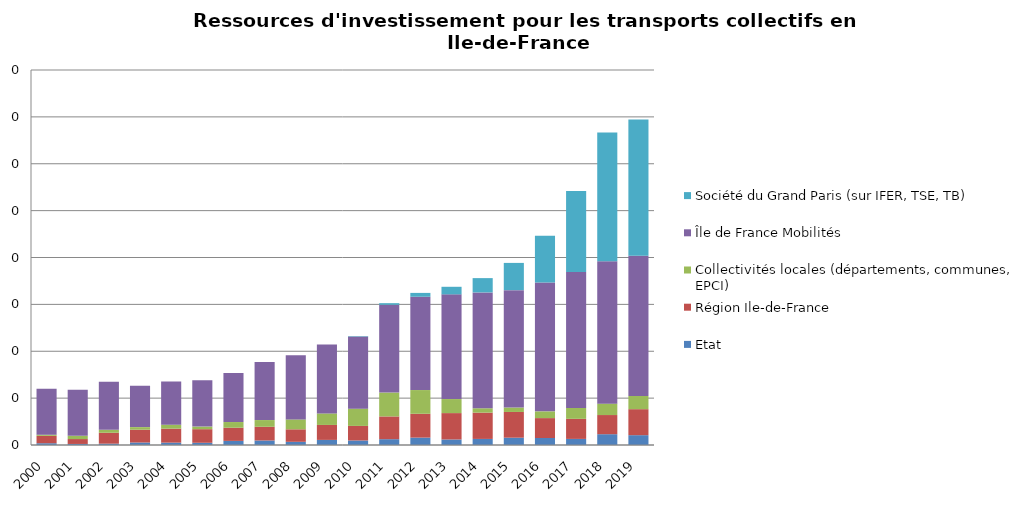
| Category | Etat | Région Ile-de-France | Collectivités locales (départements, communes, EPCI) | Île de France Mobilités | Société du Grand Paris (sur IFER, TSE, TB) |
|---|---|---|---|---|---|
| 2000.0 | 37894830.066 | 157684745.53 | 25087659.201 | 977130505.568 | 0 |
| 2001.0 | 22315563.771 | 104555136.542 | 69965010.2 | 981325528.571 | 0 |
| 2002.0 | 28302121.216 | 232856229.531 | 63188189.568 | 1024119618.901 | 0 |
| 2003.0 | 53250148.421 | 273373178.765 | 54774860.019 | 881293486.854 | 0 |
| 2004.0 | 50478879.217 | 298741713.268 | 83763872.749 | 920030381.585 | 0 |
| 2005.0 | 47415227.447 | 290228726.356 | 55534203.418 | 986459438.93 | 0 |
| 2006.0 | 87659627.655 | 281035927.931 | 121288674.926 | 1045537774.466 | 0 |
| 2007.0 | 96490887.993 | 291936207.966 | 143601838.847 | 1241136574.756 | 0 |
| 2008.0 | 67973160.995 | 266894694.224 | 210861665.15 | 1369811572.49 | 0 |
| 2009.0 | 108778098.198 | 319039274.003 | 245376671.509 | 1473276431.168 | 0 |
| 2010.0 | 96683230.19 | 310406840.442 | 368691406.306 | 1537290793.99 | 9188564.975 |
| 2011.0 | 124243322.773 | 485463601.954 | 508937825.241 | 1872453611.125 | 34406609.409 |
| 2012.0 | 157916154.809 | 508173064.666 | 506047549.857 | 1990609707.632 | 81932363.029 |
| 2013.0 | 118054287.057 | 562687652.893 | 299520668.983 | 2233517359.871 | 161339093.787 |
| 2014.0 | 129636462.597 | 561006537.049 | 92950908.492 | 2471462105.988 | 305161774.374 |
| 2015.0 | 156132063.238 | 548685776.192 | 94316319.036 | 2504416071.155 | 581150450.892 |
| 2016.0 | 149343617.788 | 424618999.992 | 144052773.866 | 2749035455.224 | 996420558.359 |
| 2017.0 | 130060669.532 | 428029486.572 | 231012877.759 | 2899967433.888 | 1730784339.465 |
| 2018.0 | 230459343.94 | 408737885.772 | 243397326.751 | 3039474323.059 | 2745606561.214 |
| 2019.0 | 209670322.72 | 554698426.09 | 281750062.424 | 2991136309.97 | 2905280000 |